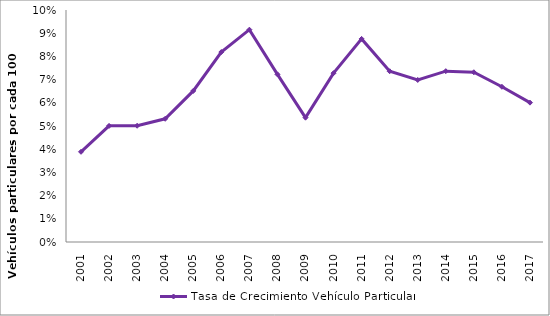
| Category | Tasa de Crecimiento Vehículo Particular |
|---|---|
| 2001.0 | 0.039 |
| 2002.0 | 0.05 |
| 2003.0 | 0.05 |
| 2004.0 | 0.053 |
| 2005.0 | 0.065 |
| 2006.0 | 0.082 |
| 2007.0 | 0.092 |
| 2008.0 | 0.072 |
| 2009.0 | 0.054 |
| 2010.0 | 0.073 |
| 2011.0 | 0.088 |
| 2012.0 | 0.074 |
| 2013.0 | 0.07 |
| 2014.0 | 0.074 |
| 2015.0 | 0.073 |
| 2016.0 | 0.067 |
| 2017.0 | 0.06 |